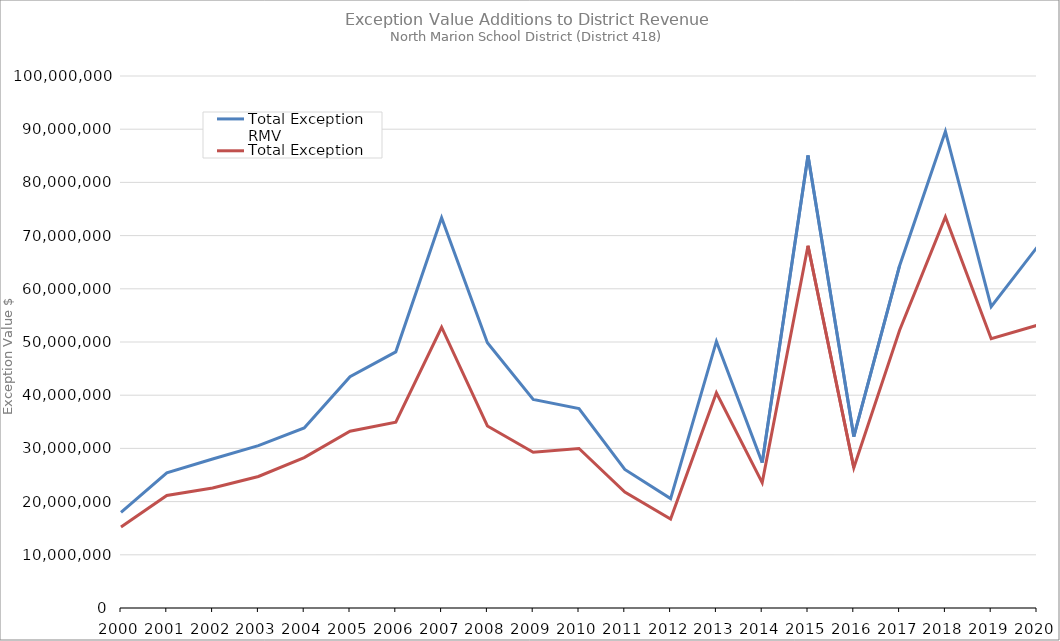
| Category | Total Exception RMV | Total Exception MAV |
|---|---|---|
| 2000.0 | 17954798 | 15213055 |
| 2001.0 | 25414383 | 21147617 |
| 2002.0 | 28000562 | 22543379 |
| 2003.0 | 30519150 | 24727098 |
| 2004.0 | 33856442 | 28263943 |
| 2005.0 | 43482623 | 33239513 |
| 2006.0 | 48149235 | 34924140 |
| 2007.0 | 73352230 | 52775983 |
| 2008.0 | 49861722 | 34216514 |
| 2009.0 | 39190291 | 29264836 |
| 2010.0 | 37488323 | 29979985 |
| 2011.0 | 26033877 | 21779533 |
| 2012.0 | 20562333 | 16715662 |
| 2013.0 | 50115737 | 40443476 |
| 2014.0 | 27328134 | 23567706 |
| 2015.0 | 85067644 | 68089863 |
| 2016.0 | 32220207 | 26370743 |
| 2017.0 | 64348151 | 52207206 |
| 2018.0 | 89582534 | 73503046 |
| 2019.0 | 56638319 | 50628781 |
| 2020.0 | 67791940 | 53141912 |